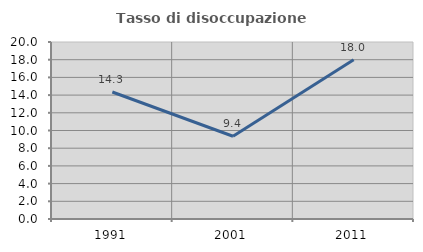
| Category | Tasso di disoccupazione giovanile  |
|---|---|
| 1991.0 | 14.348 |
| 2001.0 | 9.353 |
| 2011.0 | 17.986 |